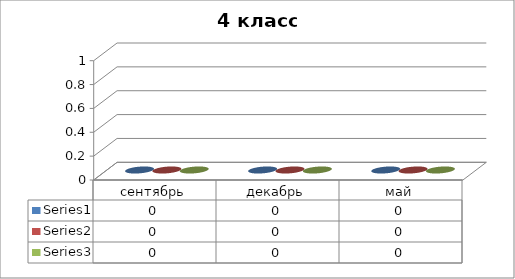
| Category | Series 0 | Series 1 | Series 2 |
|---|---|---|---|
| сентябрь | 0 | 0 | 0 |
| декабрь | 0 | 0 | 0 |
| май | 0 | 0 | 0 |